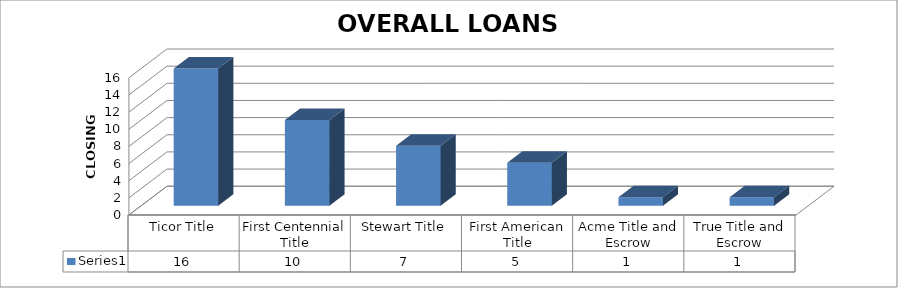
| Category | Series 0 |
|---|---|
| Ticor Title | 16 |
| First Centennial Title | 10 |
| Stewart Title | 7 |
| First American Title | 5 |
| Acme Title and Escrow | 1 |
| True Title and Escrow | 1 |